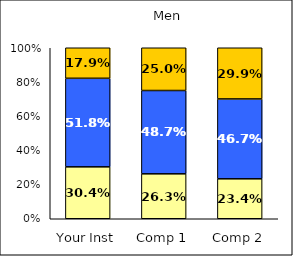
| Category | Low Institutional Priority: Commitment to Diversity | Average Institutional Priority: Commitment to Diversity | High Institutional Priority: Commitment to Diversity |
|---|---|---|---|
| Your Inst | 0.304 | 0.518 | 0.179 |
| Comp 1 | 0.263 | 0.487 | 0.25 |
| Comp 2 | 0.234 | 0.467 | 0.299 |